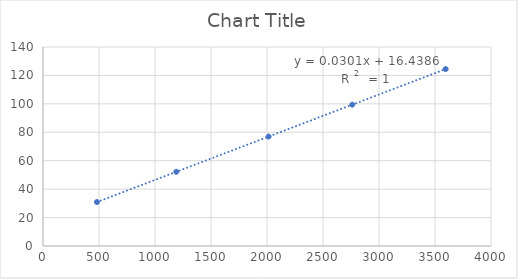
| Category | Series 0 |
|---|---|
| 481.52 | 30.91 |
| 1190.3 | 52.209 |
| 2014.4 | 76.976 |
| 2761.2 | 99.418 |
| 3595.1 | 124.48 |